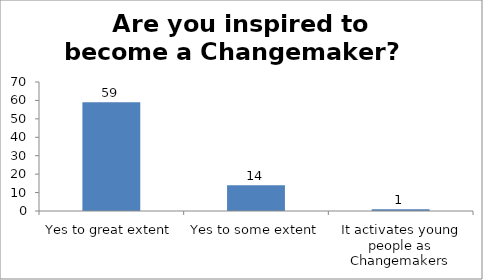
| Category | Are you inspired to become a Changemaker?   |
|---|---|
| Yes to great extent | 59 |
| Yes to some extent | 14 |
| It activates young people as Changemakers | 1 |